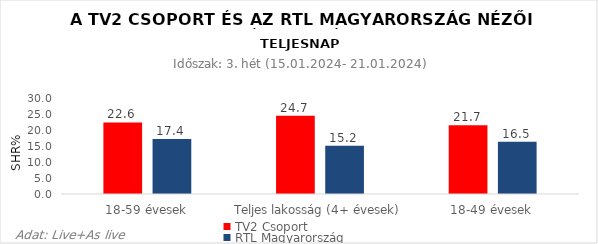
| Category | TV2 Csoport | RTL Magyarország |
|---|---|---|
| 18-59 évesek | 22.6 | 17.4 |
| Teljes lakosság (4+ évesek) | 24.7 | 15.2 |
| 18-49 évesek | 21.7 | 16.5 |